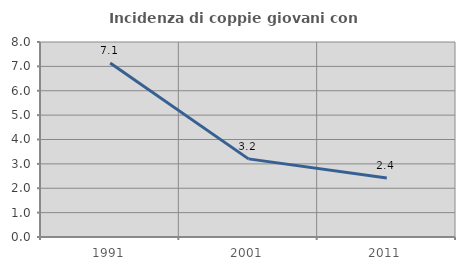
| Category | Incidenza di coppie giovani con figli |
|---|---|
| 1991.0 | 7.143 |
| 2001.0 | 3.205 |
| 2011.0 | 2.419 |